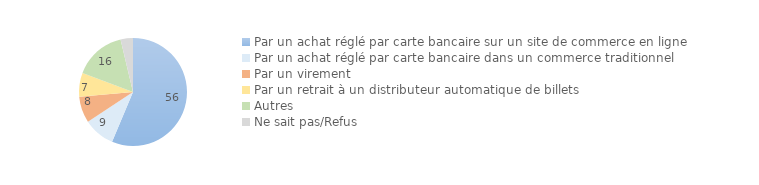
| Category | Series 0 |
|---|---|
| Par un achat réglé par carte bancaire sur un site de commerce en ligne | 56.337 |
| Par un achat réglé par carte bancaire dans un commerce traditionnel | 9.388 |
| Par un virement | 7.856 |
| Par un retrait à un distributeur automatique de billets | 7.174 |
| Autres | 15.544 |
| Ne sait pas/Refus | 3.701 |